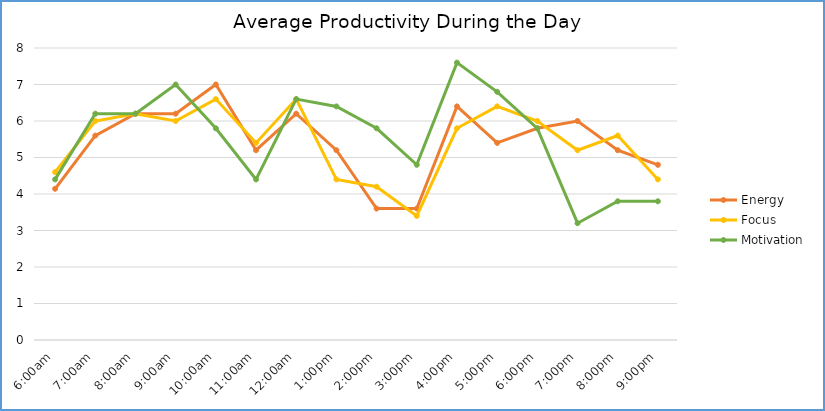
| Category | Energy | Focus | Motivation |
|---|---|---|---|
| 6:00am | 4.143 | 4.6 | 4.4 |
| 7:00am | 5.6 | 6 | 6.2 |
| 8:00am | 6.2 | 6.2 | 6.2 |
| 9:00am | 6.2 | 6 | 7 |
| 10:00am | 7 | 6.6 | 5.8 |
| 11:00am | 5.2 | 5.4 | 4.4 |
| 12:00am | 6.2 | 6.6 | 6.6 |
| 1:00pm | 5.2 | 4.4 | 6.4 |
| 2:00pm | 3.6 | 4.2 | 5.8 |
| 3:00pm | 3.6 | 3.4 | 4.8 |
| 4:00pm | 6.4 | 5.8 | 7.6 |
| 5:00pm | 5.4 | 6.4 | 6.8 |
| 6:00pm | 5.8 | 6 | 5.8 |
| 7:00pm | 6 | 5.2 | 3.2 |
| 8:00pm | 5.2 | 5.6 | 3.8 |
| 9:00pm | 4.8 | 4.4 | 3.8 |